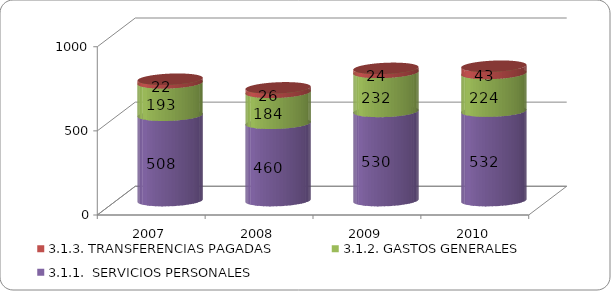
| Category | 3.1.1.  SERVICIOS PERSONALES | 3.1.2. GASTOS GENERALES | 3.1.3. TRANSFERENCIAS PAGADAS |
|---|---|---|---|
| 2007 | 507.606 | 192.618 | 21.528 |
| 2008 | 459.87 | 184.158 | 26.308 |
| 2009 | 530.294 | 232.133 | 23.729 |
| 2010 | 532 | 224 | 43 |